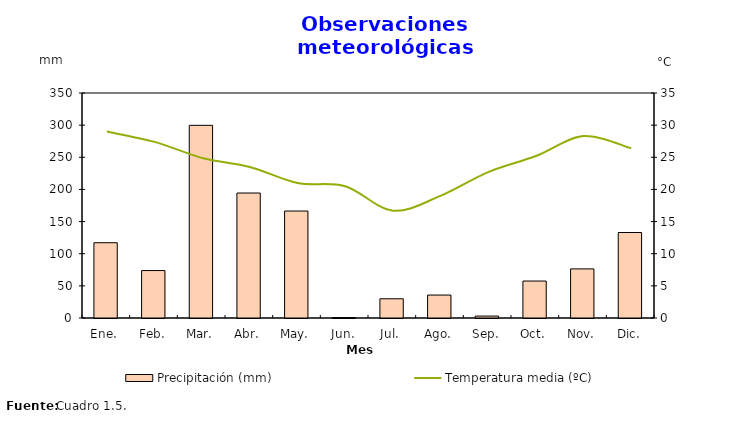
| Category | Precipitación (mm) |
|---|---|
| 0 | 117.1 |
| 1 | 73.8 |
| 2 | 299.7 |
| 3 | 194.4 |
| 4 | 166.4 |
| 5 | 0.6 |
| 6 | 29.9 |
| 7 | 35.7 |
| 8 | 3 |
| 9 | 57.5 |
| 10 | 76.4 |
| 11 | 133 |